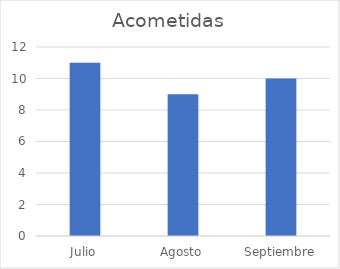
| Category | Acometidas |
|---|---|
| Julio | 11 |
| Agosto | 9 |
| Septiembre | 10 |